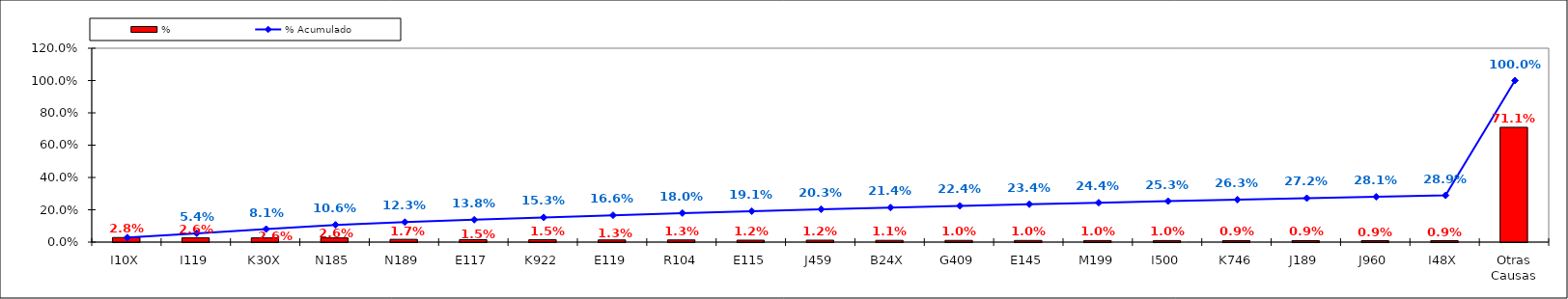
| Category | % |
|---|---|
| I10X | 0.028 |
| I119 | 0.026 |
| K30X | 0.026 |
| N185 | 0.026 |
| N189 | 0.017 |
| E117 | 0.015 |
| K922 | 0.015 |
| E119 | 0.013 |
| R104 | 0.013 |
| E115 | 0.012 |
| J459 | 0.012 |
| B24X | 0.011 |
| G409 | 0.01 |
| E145 | 0.01 |
| M199 | 0.01 |
| I500 | 0.01 |
| K746 | 0.009 |
| J189 | 0.009 |
| J960 | 0.009 |
| I48X | 0.009 |
| Otras Causas | 0.711 |